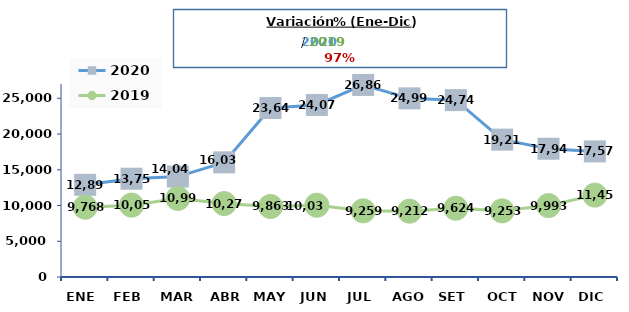
| Category | 2020 | 2019 |
|---|---|---|
| Ene | 12893 | 9768 |
| Feb | 13753 | 10054 |
| Mar | 14049 | 10992 |
| Abr | 16037 | 10274 |
| May | 23644 | 9863 |
| Jun | 24072 | 10039 |
| Jul | 26869 | 9259 |
| Ago | 24990 | 9212 |
| Set | 24744 | 9624 |
| Oct | 19219 | 9253 |
| Nov | 17948 | 9993 |
| Dic | 17573 | 11455 |